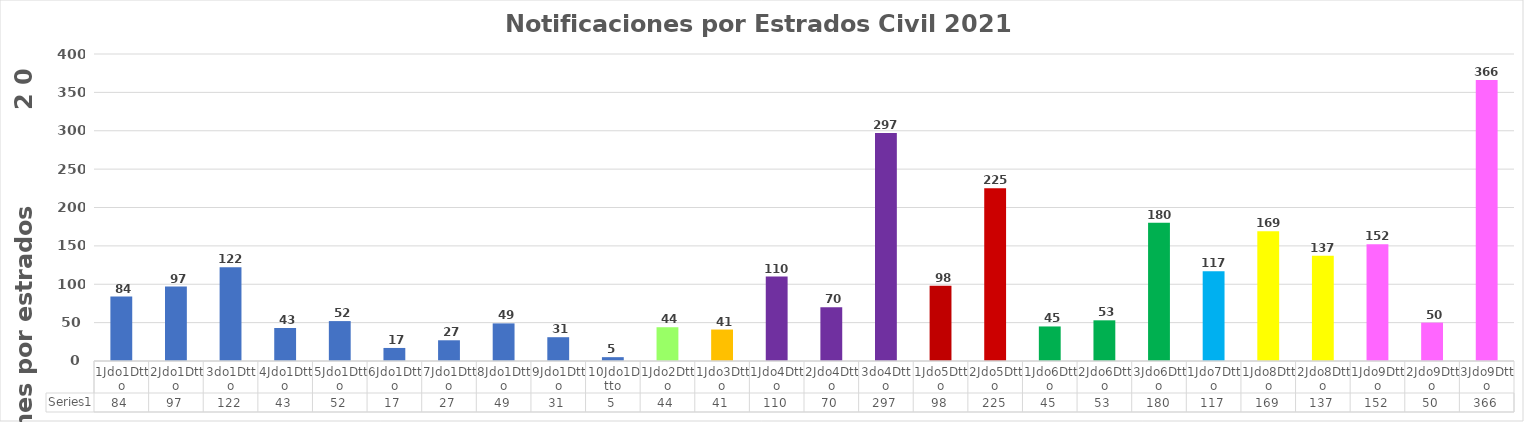
| Category | Series 0 |
|---|---|
| 1Jdo1Dtto | 84 |
| 2Jdo1Dtto | 97 |
| 3do1Dtto | 122 |
| 4Jdo1Dtto | 43 |
| 5Jdo1Dtto | 52 |
| 6Jdo1Dtto | 17 |
| 7Jdo1Dtto | 27 |
| 8Jdo1Dtto | 49 |
| 9Jdo1Dtto | 31 |
| 10Jdo1Dtto | 5 |
| 1Jdo2Dtto | 44 |
| 1Jdo3Dtto | 41 |
| 1Jdo4Dtto | 110 |
| 2Jdo4Dtto | 70 |
| 3do4Dtto | 297 |
| 1Jdo5Dtto | 98 |
| 2Jdo5Dtto | 225 |
| 1Jdo6Dtto | 45 |
| 2Jdo6Dtto | 53 |
| 3Jdo6Dtto | 180 |
| 1Jdo7Dtto | 117 |
| 1Jdo8Dtto | 169 |
| 2Jdo8Dtto | 137 |
| 1Jdo9Dtto | 152 |
| 2Jdo9Dtto | 50 |
| 3Jdo9Dtto | 366 |